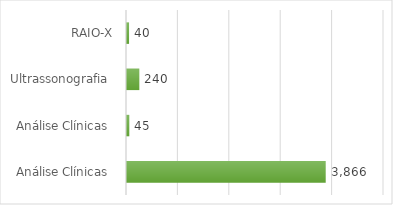
| Category | Series 0 |
|---|---|
| Análise Clínicas  | 3866 |
| Análise Clínicas  | 45 |
| Ultrassonografia  | 240 |
| RAIO-X | 40 |